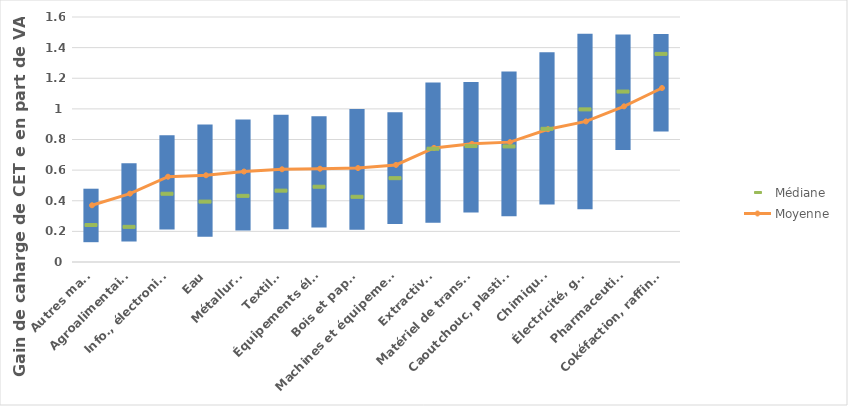
| Category | Series 0 | Series 1 |
|---|---|---|
| Autres manuf | 0.136 | 0.343 |
| Agroalimentaires | 0.141 | 0.504 |
| Info., électronique | 0.219 | 0.609 |
| Eau | 0.172 | 0.726 |
| Métallurgie | 0.212 | 0.718 |
| Textiles  | 0.22 | 0.742 |
| Équipements élec. | 0.232 | 0.721 |
| Bois et papier | 0.218 | 0.782 |
| Machines et équipements  | 0.254 | 0.724 |
| Extractives | 0.264 | 0.909 |
| Matériel de transport | 0.33 | 0.845 |
| Caoutchouc, plastique | 0.306 | 0.938 |
| Chimique  | 0.382 | 0.988 |
| Électricité, gaz  | 0.351 | 1.14 |
| Pharmaceutique | 0.737 | 0.748 |
| Cokéfaction, raffinage | 0.858 | 0.631 |